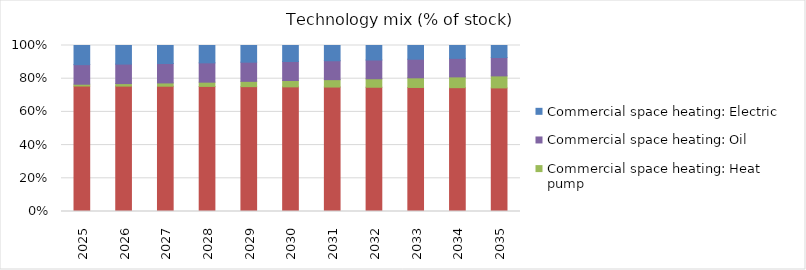
| Category | Commercial space heating: Gas | Commercial space heating: Heat pump | Commercial space heating: Oil | Commercial space heating: Electric |
|---|---|---|---|---|
| 2025.0 | 0.756 | 0.011 | 0.118 | 0.115 |
| 2026.0 | 0.755 | 0.015 | 0.117 | 0.112 |
| 2027.0 | 0.755 | 0.02 | 0.117 | 0.108 |
| 2028.0 | 0.754 | 0.026 | 0.116 | 0.105 |
| 2029.0 | 0.752 | 0.032 | 0.115 | 0.101 |
| 2030.0 | 0.751 | 0.038 | 0.115 | 0.096 |
| 2031.0 | 0.75 | 0.045 | 0.114 | 0.092 |
| 2032.0 | 0.748 | 0.051 | 0.113 | 0.087 |
| 2033.0 | 0.747 | 0.058 | 0.112 | 0.083 |
| 2034.0 | 0.746 | 0.065 | 0.111 | 0.078 |
| 2035.0 | 0.744 | 0.072 | 0.111 | 0.073 |